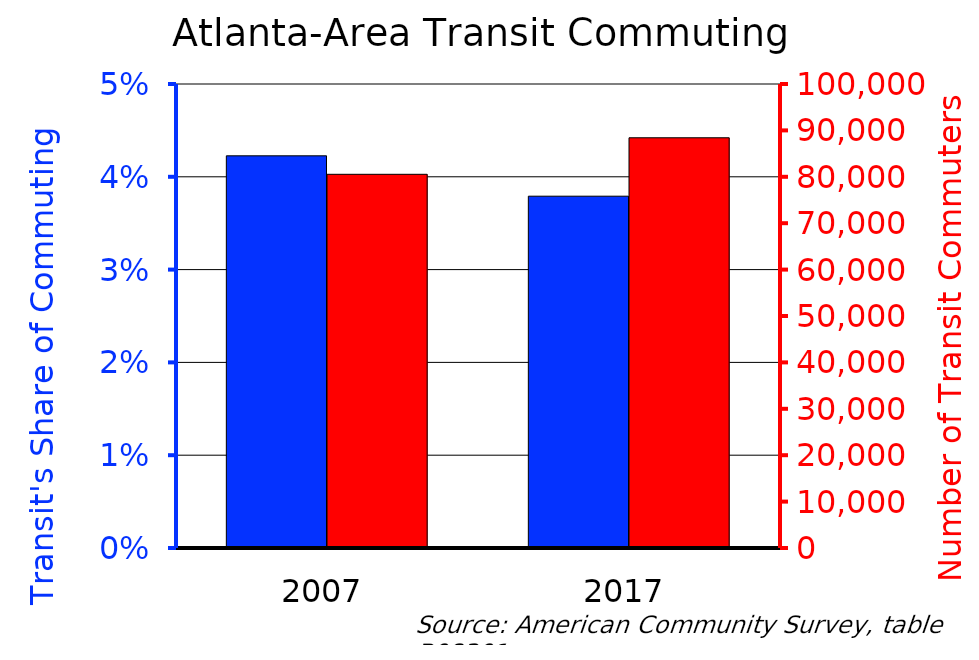
| Category | Transit's Share | Series 0 |
|---|---|---|
| 2007.0 | 0.042 |  |
| 2017.0 | 0.038 |  |